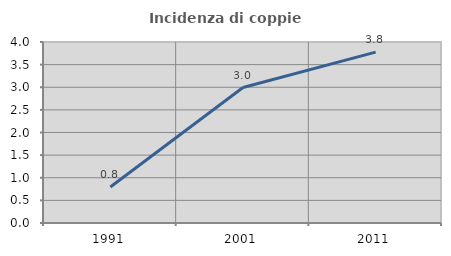
| Category | Incidenza di coppie miste |
|---|---|
| 1991.0 | 0.794 |
| 2001.0 | 2.994 |
| 2011.0 | 3.775 |